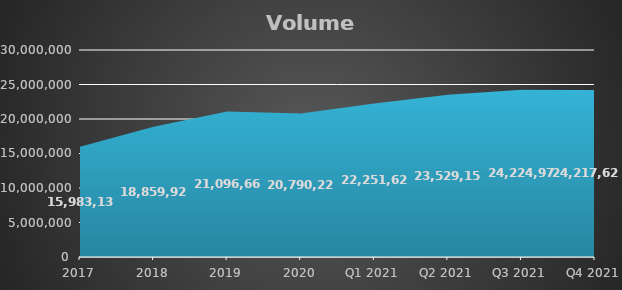
| Category | Metric Tons |
|---|---|
| 2017 | 15983139 |
| 2018 | 18859924 |
| 2019 | 21096664 |
| 2020 | 20790224 |
| Q1 2021 | 22251624 |
| Q2 2021 | 23529151 |
| Q3 2021 | 24224977 |
| Q4 2021 | 24217622 |